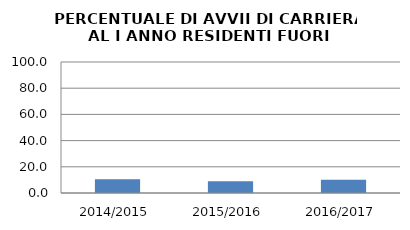
| Category | 2014/2015 2015/2016 2016/2017 |
|---|---|
| 2014/2015 | 10.413 |
| 2015/2016 | 8.901 |
| 2016/2017 | 10.066 |